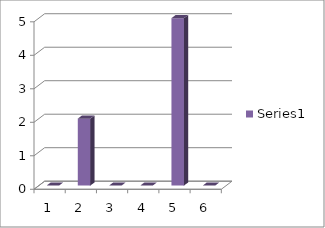
| Category | Series 0 |
|---|---|
| 0 | 0 |
| 1 | 2 |
| 2 | 0 |
| 3 | 0 |
| 4 | 5 |
| 5 | 0 |